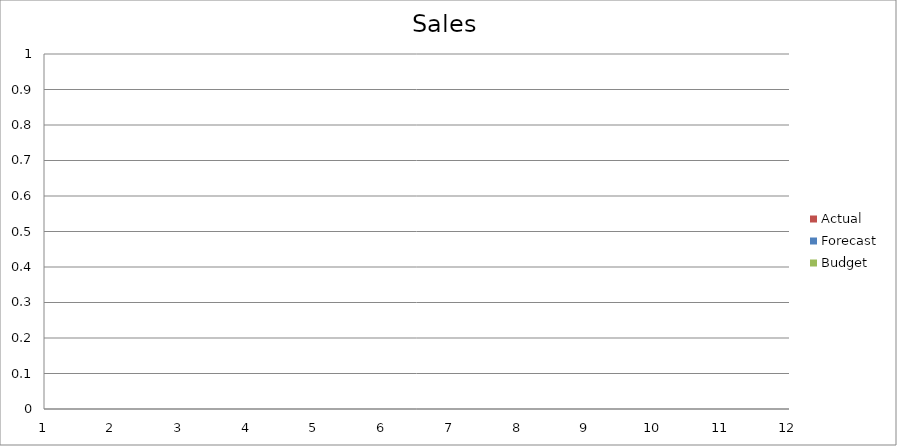
| Category | Budget | Forecast | Actual |
|---|---|---|---|
| 0 | 2030 | 2170 | 1700 |
| 1 | 550 | 960 | 1410 |
| 2 | 1280 | 3240 | 1240 |
| 3 | 2640 | 620 | 2970 |
| 4 | 2250 | 2440 | 1460 |
| 5 | 1830 | 900 | 940 |
| 6 | 2340 | 2780 | 3250 |
| 7 | 1610 | 3230 | 2360 |
| 8 | 730 | 2100 | 1580 |
| 9 | 1960 | 1420 | 890 |
| 10 | 2920 | 1600 | 2690 |
| 11 | 1830 | 510 | 2340 |